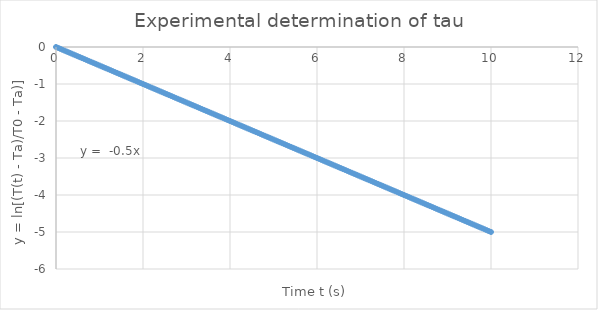
| Category | Series 0 |
|---|---|
| 0.0 | 0 |
| 0.05 | -0.025 |
| 0.1 | -0.05 |
| 0.15000000000000002 | -0.075 |
| 0.2 | -0.1 |
| 0.25 | -0.125 |
| 0.3 | -0.15 |
| 0.35 | -0.175 |
| 0.39999999999999997 | -0.2 |
| 0.44999999999999996 | -0.225 |
| 0.49999999999999994 | -0.25 |
| 0.5499999999999999 | -0.275 |
| 0.6 | -0.3 |
| 0.65 | -0.325 |
| 0.7000000000000001 | -0.35 |
| 0.7500000000000001 | -0.375 |
| 0.8000000000000002 | -0.4 |
| 0.8500000000000002 | -0.425 |
| 0.9000000000000002 | -0.45 |
| 0.9500000000000003 | -0.475 |
| 1.0000000000000002 | -0.5 |
| 1.0500000000000003 | -0.525 |
| 1.1000000000000003 | -0.55 |
| 1.1500000000000004 | -0.575 |
| 1.2000000000000004 | -0.6 |
| 1.2500000000000004 | -0.625 |
| 1.3000000000000005 | -0.65 |
| 1.3500000000000005 | -0.675 |
| 1.4000000000000006 | -0.7 |
| 1.4500000000000006 | -0.725 |
| 1.5000000000000007 | -0.75 |
| 1.5500000000000007 | -0.775 |
| 1.6000000000000008 | -0.8 |
| 1.6500000000000008 | -0.825 |
| 1.7000000000000008 | -0.85 |
| 1.7500000000000009 | -0.875 |
| 1.800000000000001 | -0.9 |
| 1.850000000000001 | -0.925 |
| 1.900000000000001 | -0.95 |
| 1.950000000000001 | -0.975 |
| 2.000000000000001 | -1 |
| 2.0500000000000007 | -1.025 |
| 2.1000000000000005 | -1.05 |
| 2.1500000000000004 | -1.075 |
| 2.2 | -1.1 |
| 2.25 | -1.125 |
| 2.3 | -1.15 |
| 2.3499999999999996 | -1.175 |
| 2.3999999999999995 | -1.2 |
| 2.4499999999999993 | -1.225 |
| 2.499999999999999 | -1.25 |
| 2.549999999999999 | -1.275 |
| 2.5999999999999988 | -1.3 |
| 2.6499999999999986 | -1.325 |
| 2.6999999999999984 | -1.35 |
| 2.7499999999999982 | -1.375 |
| 2.799999999999998 | -1.4 |
| 2.849999999999998 | -1.425 |
| 2.8999999999999977 | -1.45 |
| 2.9499999999999975 | -1.475 |
| 2.9999999999999973 | -1.5 |
| 3.049999999999997 | -1.525 |
| 3.099999999999997 | -1.55 |
| 3.149999999999997 | -1.575 |
| 3.1999999999999966 | -1.6 |
| 3.2499999999999964 | -1.625 |
| 3.2999999999999963 | -1.65 |
| 3.349999999999996 | -1.675 |
| 3.399999999999996 | -1.7 |
| 3.4499999999999957 | -1.725 |
| 3.4999999999999956 | -1.75 |
| 3.5499999999999954 | -1.775 |
| 3.599999999999995 | -1.8 |
| 3.649999999999995 | -1.825 |
| 3.699999999999995 | -1.85 |
| 3.7499999999999947 | -1.875 |
| 3.7999999999999945 | -1.9 |
| 3.8499999999999943 | -1.925 |
| 3.899999999999994 | -1.95 |
| 3.949999999999994 | -1.975 |
| 3.999999999999994 | -2 |
| 4.049999999999994 | -2.025 |
| 4.099999999999993 | -2.05 |
| 4.149999999999993 | -2.075 |
| 4.199999999999993 | -2.1 |
| 4.249999999999993 | -2.125 |
| 4.299999999999993 | -2.15 |
| 4.3499999999999925 | -2.175 |
| 4.399999999999992 | -2.2 |
| 4.449999999999992 | -2.225 |
| 4.499999999999992 | -2.25 |
| 4.549999999999992 | -2.275 |
| 4.599999999999992 | -2.3 |
| 4.6499999999999915 | -2.325 |
| 4.699999999999991 | -2.35 |
| 4.749999999999991 | -2.375 |
| 4.799999999999991 | -2.4 |
| 4.849999999999991 | -2.425 |
| 4.899999999999991 | -2.45 |
| 4.94999999999999 | -2.475 |
| 4.99999999999999 | -2.5 |
| 5.04999999999999 | -2.525 |
| 5.09999999999999 | -2.55 |
| 5.14999999999999 | -2.575 |
| 5.1999999999999895 | -2.6 |
| 5.249999999999989 | -2.625 |
| 5.299999999999989 | -2.65 |
| 5.349999999999989 | -2.675 |
| 5.399999999999989 | -2.7 |
| 5.449999999999989 | -2.725 |
| 5.4999999999999885 | -2.75 |
| 5.549999999999988 | -2.775 |
| 5.599999999999988 | -2.8 |
| 5.649999999999988 | -2.825 |
| 5.699999999999988 | -2.85 |
| 5.749999999999988 | -2.875 |
| 5.799999999999987 | -2.9 |
| 5.849999999999987 | -2.925 |
| 5.899999999999987 | -2.95 |
| 5.949999999999987 | -2.975 |
| 5.999999999999987 | -3 |
| 6.0499999999999865 | -3.025 |
| 6.099999999999986 | -3.05 |
| 6.149999999999986 | -3.075 |
| 6.199999999999986 | -3.1 |
| 6.249999999999986 | -3.125 |
| 6.299999999999986 | -3.15 |
| 6.349999999999985 | -3.175 |
| 6.399999999999985 | -3.2 |
| 6.449999999999985 | -3.225 |
| 6.499999999999985 | -3.25 |
| 6.549999999999985 | -3.275 |
| 6.5999999999999845 | -3.3 |
| 6.649999999999984 | -3.325 |
| 6.699999999999984 | -3.35 |
| 6.749999999999984 | -3.375 |
| 6.799999999999984 | -3.4 |
| 6.849999999999984 | -3.425 |
| 6.8999999999999835 | -3.45 |
| 6.949999999999983 | -3.475 |
| 6.999999999999983 | -3.5 |
| 7.049999999999983 | -3.525 |
| 7.099999999999983 | -3.55 |
| 7.149999999999983 | -3.575 |
| 7.199999999999982 | -3.6 |
| 7.249999999999982 | -3.625 |
| 7.299999999999982 | -3.65 |
| 7.349999999999982 | -3.675 |
| 7.399999999999982 | -3.7 |
| 7.4499999999999815 | -3.725 |
| 7.499999999999981 | -3.75 |
| 7.549999999999981 | -3.775 |
| 7.599999999999981 | -3.8 |
| 7.649999999999981 | -3.825 |
| 7.699999999999981 | -3.85 |
| 7.7499999999999805 | -3.875 |
| 7.79999999999998 | -3.9 |
| 7.84999999999998 | -3.925 |
| 7.89999999999998 | -3.95 |
| 7.94999999999998 | -3.975 |
| 7.99999999999998 | -4 |
| 8.04999999999998 | -4.025 |
| 8.09999999999998 | -4.05 |
| 8.14999999999998 | -4.075 |
| 8.199999999999982 | -4.1 |
| 8.249999999999982 | -4.125 |
| 8.299999999999983 | -4.15 |
| 8.349999999999984 | -4.175 |
| 8.399999999999984 | -4.2 |
| 8.449999999999985 | -4.225 |
| 8.499999999999986 | -4.25 |
| 8.549999999999986 | -4.275 |
| 8.599999999999987 | -4.3 |
| 8.649999999999988 | -4.325 |
| 8.699999999999989 | -4.35 |
| 8.74999999999999 | -4.375 |
| 8.79999999999999 | -4.4 |
| 8.84999999999999 | -4.425 |
| 8.899999999999991 | -4.45 |
| 8.949999999999992 | -4.475 |
| 8.999999999999993 | -4.5 |
| 9.049999999999994 | -4.525 |
| 9.099999999999994 | -4.55 |
| 9.149999999999995 | -4.575 |
| 9.199999999999996 | -4.6 |
| 9.249999999999996 | -4.625 |
| 9.299999999999997 | -4.65 |
| 9.349999999999998 | -4.675 |
| 9.399999999999999 | -4.7 |
| 9.45 | -4.725 |
| 9.5 | -4.75 |
| 9.55 | -4.775 |
| 9.600000000000001 | -4.8 |
| 9.650000000000002 | -4.825 |
| 9.700000000000003 | -4.85 |
| 9.750000000000004 | -4.875 |
| 9.800000000000004 | -4.9 |
| 9.850000000000005 | -4.925 |
| 9.900000000000006 | -4.95 |
| 9.950000000000006 | -4.975 |
| 10.000000000000007 | -5 |